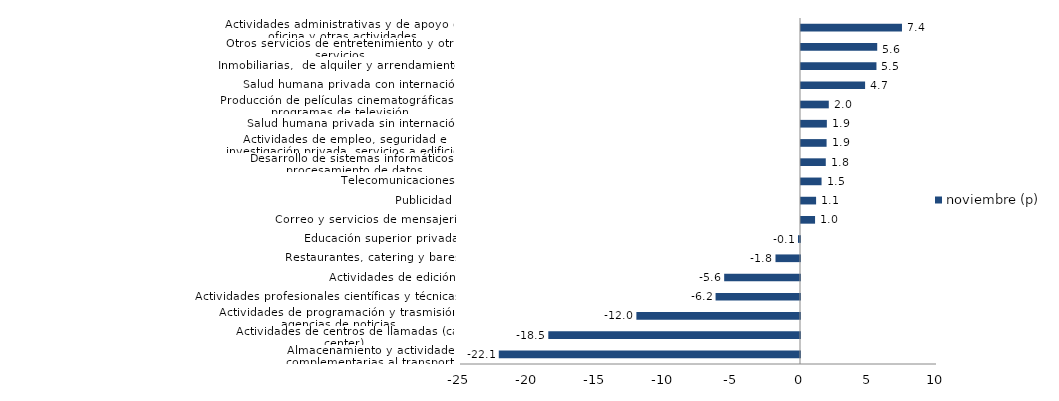
| Category | noviembre (p) |
|---|---|
| Almacenamiento y actividades complementarias al transporte | -22.149 |
| Actividades de centros de llamadas (call center) | -18.508 |
| Actividades de programación y trasmisión,  agencias de noticias | -12.03 |
| Actividades profesionales científicas y técnicas  | -6.208 |
| Actividades de edición | -5.576 |
| Restaurantes, catering y bares | -1.803 |
| Educación superior privada | -0.149 |
| Correo y servicios de mensajería | 1.034 |
| Publicidad | 1.11 |
| Telecomunicaciones | 1.511 |
| Desarrollo de sistemas informáticos y procesamiento de datos | 1.822 |
| Actividades de empleo, seguridad e investigación privada, servicios a edificios | 1.881 |
| Salud humana privada sin internación | 1.901 |
| Producción de películas cinematográficas y programas de televisión | 2.044 |
| Salud humana privada con internación | 4.713 |
| Inmobiliarias,  de alquiler y arrendamiento  | 5.548 |
| Otros servicios de entretenimiento y otros servicios | 5.604 |
| Actividades administrativas y de apoyo de oficina y otras actividades | 7.425 |